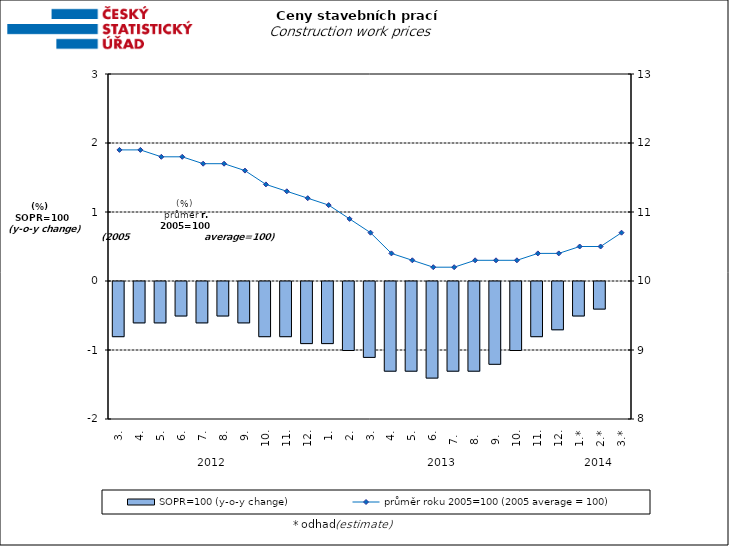
| Category | SOPR=100 (y-o-y change)   |
|---|---|
| 0 | -0.8 |
| 1 | -0.6 |
| 2 | -0.6 |
| 3 | -0.5 |
| 4 | -0.6 |
| 5 | -0.5 |
| 6 | -0.6 |
| 7 | -0.8 |
| 8 | -0.8 |
| 9 | -0.9 |
| 10 | -0.9 |
| 11 | -1 |
| 12 | -1.1 |
| 13 | -1.3 |
| 14 | -1.3 |
| 15 | -1.4 |
| 16 | -1.3 |
| 17 | -1.3 |
| 18 | -1.2 |
| 19 | -1 |
| 20 | -0.8 |
| 21 | -0.7 |
| 22 | -0.5 |
| 23 | -0.4 |
| 24 | 0 |